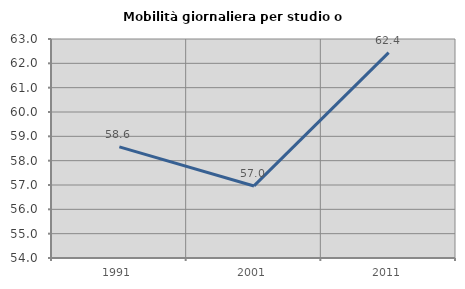
| Category | Mobilità giornaliera per studio o lavoro |
|---|---|
| 1991.0 | 58.568 |
| 2001.0 | 56.961 |
| 2011.0 | 62.439 |